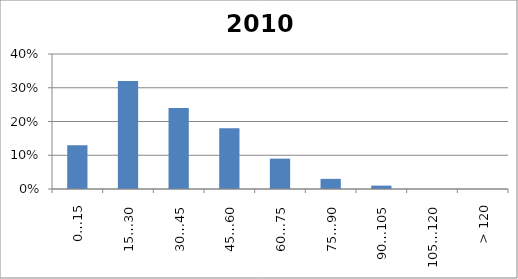
| Category | 2010 |
|---|---|
| 0…15 | 0.13 |
| 15…30 | 0.32 |
| 30…45 | 0.24 |
| 45…60 | 0.18 |
| 60…75 | 0.09 |
| 75…90 | 0.03 |
| 90…105 | 0.01 |
| 105…120 | 0 |
| > 120 | 0 |